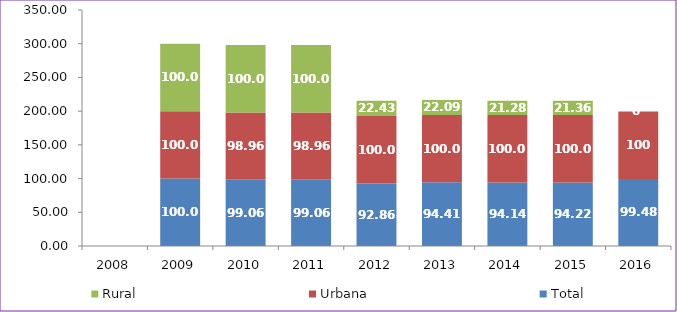
| Category | Total | Urbana | Rural |
|---|---|---|---|
| 2008.0 | 0 | 0 | 0 |
| 2009.0 | 100 | 100 | 100 |
| 2010.0 | 99.06 | 98.96 | 100 |
| 2011.0 | 99.06 | 98.96 | 100 |
| 2012.0 | 92.86 | 100 | 22.43 |
| 2013.0 | 94.41 | 100 | 22.09 |
| 2014.0 | 94.14 | 100 | 21.28 |
| 2015.0 | 94.22 | 100 | 21.36 |
| 2016.0 | 99.48 | 100 | 0 |